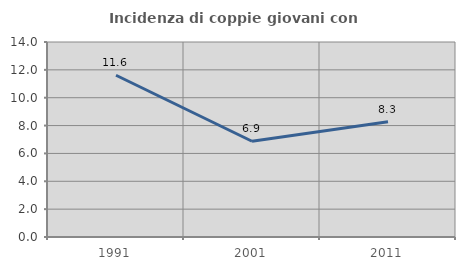
| Category | Incidenza di coppie giovani con figli |
|---|---|
| 1991.0 | 11.613 |
| 2001.0 | 6.875 |
| 2011.0 | 8.28 |